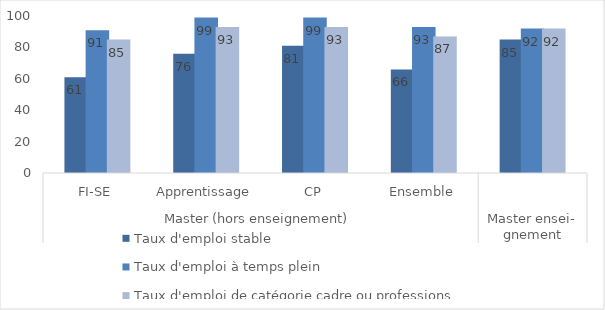
| Category | Taux d'emploi stable | Taux d'emploi à temps plein | Taux d'emploi de catégorie cadre ou professions intermédiaires |
|---|---|---|---|
| 0 | 61 | 91 | 85 |
| 1 | 76 | 99 | 93 |
| 2 | 81 | 99 | 93 |
| 3 | 66 | 93 | 87 |
| 4 | 85 | 92 | 92 |